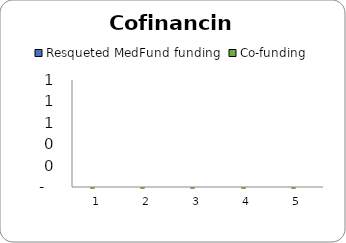
| Category | Resqueted MedFund funding | Co-funding |
|---|---|---|
| 0 | 0 | 0 |
| 1 | 0 | 0 |
| 2 | 0 | 0 |
| 3 | 0 | 0 |
| 4 | 0 | 0 |